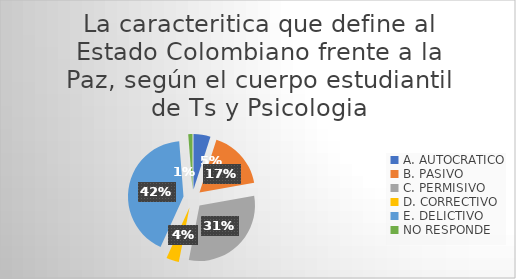
| Category | Series 0 |
|---|---|
| A. AUTOCRATICO | 4 |
| B. PASIVO | 14 |
| C. PERMISIVO | 25 |
| D. CORRECTIVO | 3 |
| E. DELICTIVO | 34 |
| NO RESPONDE | 1 |